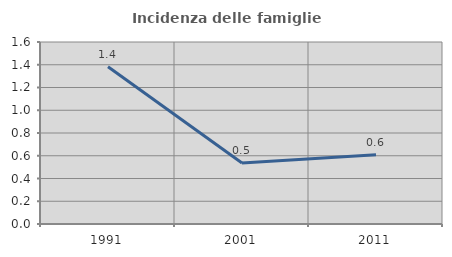
| Category | Incidenza delle famiglie numerose |
|---|---|
| 1991.0 | 1.382 |
| 2001.0 | 0.536 |
| 2011.0 | 0.608 |